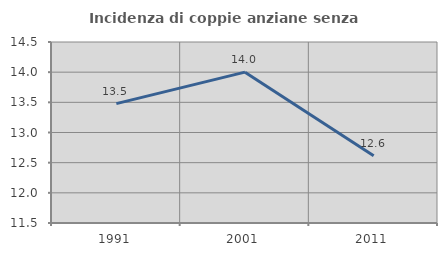
| Category | Incidenza di coppie anziane senza figli  |
|---|---|
| 1991.0 | 13.478 |
| 2001.0 | 14 |
| 2011.0 | 12.615 |